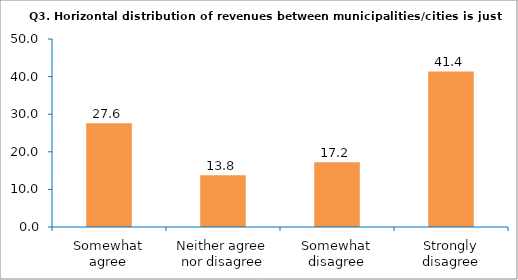
| Category | Series 0 |
|---|---|
| Somewhat agree | 27.586 |
| Neither agree nor disagree | 13.793 |
| Somewhat disagree | 17.241 |
| Strongly disagree | 41.379 |